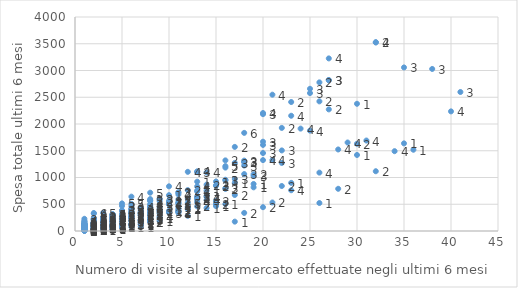
| Category | spesa |
|---|---|
| 4.0 | 309 |
| 6.0 | 295 |
| 3.0 | 101 |
| 3.0 | 71 |
| 5.0 | 144 |
| 1.0 | 9 |
| 1.0 | 52 |
| 18.0 | 1223 |
| 5.0 | 72 |
| 10.0 | 341 |
| 1.0 | 89 |
| 4.0 | 41 |
| 2.0 | 75 |
| 2.0 | 194 |
| 2.0 | 35 |
| 8.0 | 177 |
| 2.0 | 71 |
| 4.0 | 72 |
| 6.0 | 364 |
| 1.0 | 85 |
| 1.0 | 127 |
| 9.0 | 330 |
| 1.0 | 58 |
| 17.0 | 1273 |
| 6.0 | 247 |
| 8.0 | 344 |
| 3.0 | 339 |
| 7.0 | 355 |
| 1.0 | 84 |
| 2.0 | 110 |
| 2.0 | 145 |
| 1.0 | 33 |
| 4.0 | 284 |
| 16.0 | 1185 |
| 2.0 | 39 |
| 6.0 | 235 |
| 22.0 | 1506 |
| 11.0 | 683 |
| 1.0 | 93 |
| 11.0 | 359 |
| 7.0 | 441 |
| 18.0 | 1287 |
| 2.0 | 20 |
| 1.0 | 85 |
| 3.0 | 144 |
| 20.0 | 1325 |
| 15.0 | 505 |
| 1.0 | 67 |
| 14.0 | 639 |
| 2.0 | 151 |
| 2.0 | 212 |
| 5.0 | 141 |
| 8.0 | 298 |
| 7.0 | 341 |
| 1.0 | 25 |
| 1.0 | 105 |
| 3.0 | 156 |
| 2.0 | 73 |
| 13.0 | 835 |
| 1.0 | 41 |
| 5.0 | 215 |
| 5.0 | 92 |
| 1.0 | 7 |
| 23.0 | 2411 |
| 25.0 | 2658 |
| 2.0 | 38 |
| 1.0 | 24 |
| 3.0 | 166 |
| 5.0 | 92 |
| 2.0 | 171 |
| 6.0 | 124 |
| 12.0 | 410 |
| 12.0 | 284 |
| 7.0 | 125 |
| 4.0 | 115 |
| 17.0 | 972 |
| 4.0 | 97 |
| 8.0 | 343 |
| 4.0 | 135 |
| 1.0 | 64 |
| 2.0 | 51 |
| 1.0 | 125 |
| 1.0 | 38 |
| 3.0 | 200 |
| 11.0 | 380 |
| 8.0 | 352 |
| 2.0 | 62 |
| 13.0 | 740 |
| 2.0 | 336 |
| 27.0 | 2819 |
| 1.0 | 51 |
| 11.0 | 541 |
| 5.0 | 170 |
| 1.0 | 29 |
| 6.0 | 234 |
| 9.0 | 593 |
| 9.0 | 188 |
| 2.0 | 149 |
| 14.0 | 867 |
| 2.0 | 72 |
| 14.0 | 1094 |
| 7.0 | 293 |
| 20.0 | 1609 |
| 2.0 | 129 |
| 4.0 | 96 |
| 22.0 | 1272 |
| 6.0 | 363 |
| 2.0 | 102 |
| 13.0 | 922 |
| 2.0 | 100 |
| 35.0 | 3057 |
| 15.0 | 563 |
| 2.0 | 54 |
| 2.0 | 60 |
| 5.0 | 264 |
| 5.0 | 276 |
| 1.0 | 100 |
| 6.0 | 298 |
| 4.0 | 133 |
| 1.0 | 20 |
| 3.0 | 121 |
| 1.0 | 23 |
| 2.0 | 147 |
| 8.0 | 442 |
| 17.0 | 901 |
| 6.0 | 343 |
| 2.0 | 123 |
| 3.0 | 235 |
| 4.0 | 278 |
| 6.0 | 260 |
| 1.0 | 149 |
| 30.0 | 2378 |
| 3.0 | 55 |
| 5.0 | 232 |
| 1.0 | 22 |
| 22.0 | 841 |
| 16.0 | 1320 |
| 1.0 | 75 |
| 2.0 | 77 |
| 1.0 | 118 |
| 3.0 | 209 |
| 10.0 | 533 |
| 2.0 | 103 |
| 2.0 | 131 |
| 3.0 | 83 |
| 8.0 | 315 |
| 3.0 | 132 |
| 9.0 | 242 |
| 1.0 | 48 |
| 4.0 | 192 |
| 7.0 | 197 |
| 1.0 | 5 |
| 22.0 | 1927 |
| 4.0 | 215 |
| 4.0 | 41 |
| 4.0 | 238 |
| 21.0 | 1325 |
| 14.0 | 658 |
| 23.0 | 762 |
| 13.0 | 756 |
| 4.0 | 109 |
| 2.0 | 53 |
| 41.0 | 2598 |
| 1.0 | 119 |
| 1.0 | 114 |
| 12.0 | 425 |
| 8.0 | 435 |
| 35.0 | 1638 |
| 1.0 | 88 |
| 1.0 | 76 |
| 3.0 | 163 |
| 8.0 | 344 |
| 6.0 | 190 |
| 12.0 | 525 |
| 3.0 | 69 |
| 1.0 | 103 |
| 17.0 | 1572 |
| 3.0 | 26 |
| 8.0 | 387 |
| 12.0 | 604 |
| 2.0 | 86 |
| 20.0 | 1669 |
| 2.0 | 74 |
| 2.0 | 326 |
| 31.0 | 1691 |
| 5.0 | 374 |
| 3.0 | 254 |
| 2.0 | 53 |
| 38.0 | 3029 |
| 1.0 | 69 |
| 2.0 | 22 |
| 7.0 | 298 |
| 2.0 | 224 |
| 9.0 | 600 |
| 7.0 | 321 |
| 3.0 | 144 |
| 3.0 | 258 |
| 30.0 | 1421 |
| 6.0 | 81 |
| 13.0 | 582 |
| 2.0 | 119 |
| 3.0 | 157 |
| 2.0 | 154 |
| 28.0 | 1524 |
| 11.0 | 515 |
| 18.0 | 1316 |
| 32.0 | 3529 |
| 11.0 | 357 |
| 26.0 | 523 |
| 10.0 | 508 |
| 6.0 | 508 |
| 6.0 | 257 |
| 34.0 | 1492 |
| 3.0 | 174 |
| 13.0 | 461 |
| 1.0 | 10 |
| 1.0 | 55 |
| 2.0 | 72 |
| 8.0 | 235 |
| 2.0 | 161 |
| 6.0 | 179 |
| 5.0 | 387 |
| 7.0 | 170 |
| 4.0 | 197 |
| 11.0 | 585 |
| 20.0 | 2184 |
| 11.0 | 339 |
| 9.0 | 369 |
| 5.0 | 239 |
| 2.0 | 92 |
| 19.0 | 1060 |
| 13.0 | 538 |
| 8.0 | 476 |
| 4.0 | 197 |
| 2.0 | 59 |
| 2.0 | 67 |
| 2.0 | 121 |
| 1.0 | 46 |
| 3.0 | 72 |
| 2.0 | 63 |
| 6.0 | 274 |
| 1.0 | 107 |
| 2.0 | 34 |
| 5.0 | 150 |
| 4.0 | 140 |
| 5.0 | 469 |
| 4.0 | 100 |
| 1.0 | 54 |
| 2.0 | 95 |
| 10.0 | 376 |
| 2.0 | 45 |
| 2.0 | 71 |
| 3.0 | 119 |
| 12.0 | 764 |
| 6.0 | 417 |
| 4.0 | 162 |
| 8.0 | 297 |
| 1.0 | 52 |
| 2.0 | 69 |
| 2.0 | 26 |
| 1.0 | 75 |
| 4.0 | 148 |
| 4.0 | 230 |
| 5.0 | 68 |
| 16.0 | 946 |
| 9.0 | 389 |
| 10.0 | 365 |
| 3.0 | 146 |
| 11.0 | 724 |
| 2.0 | 153 |
| 4.0 | 232 |
| 2.0 | 46 |
| 1.0 | 62 |
| 1.0 | 30 |
| 10.0 | 563 |
| 9.0 | 441 |
| 19.0 | 879 |
| 11.0 | 716 |
| 5.0 | 516 |
| 4.0 | 291 |
| 3.0 | 53 |
| 4.0 | 71 |
| 1.0 | 62 |
| 11.0 | 456 |
| 2.0 | 69 |
| 4.0 | 94 |
| 19.0 | 816 |
| 2.0 | 141 |
| 3.0 | 74 |
| 3.0 | 54 |
| 25.0 | 2578 |
| 7.0 | 348 |
| 7.0 | 355 |
| 14.0 | 429 |
| 3.0 | 189 |
| 7.0 | 200 |
| 2.0 | 149 |
| 1.0 | 59 |
| 4.0 | 189 |
| 2.0 | 106 |
| 1.0 | 12 |
| 4.0 | 196 |
| 5.0 | 99 |
| 1.0 | 37 |
| 2.0 | 239 |
| 1.0 | 24 |
| 8.0 | 201 |
| 4.0 | 247 |
| 10.0 | 670 |
| 24.0 | 1914 |
| 2.0 | 25 |
| 18.0 | 1834 |
| 1.0 | 105 |
| 13.0 | 630 |
| 6.0 | 467 |
| 18.0 | 1064 |
| 2.0 | 210 |
| 8.0 | 366 |
| 14.0 | 754 |
| 3.0 | 77 |
| 7.0 | 394 |
| 16.0 | 799 |
| 5.0 | 114 |
| 13.0 | 608 |
| 20.0 | 445 |
| 3.0 | 160 |
| 1.0 | 46 |
| 32.0 | 3524 |
| 1.0 | 121 |
| 27.0 | 3226 |
| 7.0 | 330 |
| 23.0 | 2154 |
| 27.0 | 2821 |
| 11.0 | 517 |
| 8.0 | 176 |
| 3.0 | 199 |
| 25.0 | 1876 |
| 3.0 | 109 |
| 2.0 | 157 |
| 3.0 | 55 |
| 2.0 | 211 |
| 1.0 | 3 |
| 15.0 | 925 |
| 1.0 | 17 |
| 4.0 | 168 |
| 8.0 | 398 |
| 21.0 | 2548 |
| 4.0 | 187 |
| 7.0 | 306 |
| 26.0 | 2778 |
| 1.0 | 119 |
| 18.0 | 1290 |
| 1.0 | 137 |
| 2.0 | 122 |
| 7.0 | 216 |
| 1.0 | 49 |
| 26.0 | 1091 |
| 5.0 | 238 |
| 15.0 | 846 |
| 3.0 | 189 |
| 2.0 | 146 |
| 12.0 | 449 |
| 7.0 | 412 |
| 1.0 | 45 |
| 32.0 | 1117 |
| 1.0 | 53 |
| 17.0 | 673 |
| 1.0 | 26 |
| 7.0 | 151 |
| 1.0 | 123 |
| 2.0 | 230 |
| 2.0 | 47 |
| 4.0 | 87 |
| 7.0 | 120 |
| 1.0 | 55 |
| 5.0 | 132 |
| 15.0 | 854 |
| 16.0 | 788 |
| 8.0 | 246 |
| 1.0 | 89 |
| 1.0 | 138 |
| 8.0 | 341 |
| 1.0 | 72 |
| 3.0 | 186 |
| 1.0 | 53 |
| 6.0 | 642 |
| 1.0 | 32 |
| 8.0 | 414 |
| 4.0 | 48 |
| 30.0 | 1630 |
| 3.0 | 79 |
| 1.0 | 171 |
| 14.0 | 579 |
| 4.0 | 313 |
| 12.0 | 1106 |
| 4.0 | 260 |
| 2.0 | 142 |
| 8.0 | 571 |
| 3.0 | 39 |
| 8.0 | 327 |
| 2.0 | 69 |
| 4.0 | 246 |
| 8.0 | 217 |
| 29.0 | 1654 |
| 16.0 | 1213 |
| 6.0 | 121 |
| 5.0 | 205 |
| 1.0 | 24 |
| 4.0 | 310 |
| 5.0 | 311 |
| 4.0 | 300 |
| 1.0 | 76 |
| 7.0 | 195 |
| 1.0 | 48 |
| 23.0 | 900 |
| 20.0 | 1457 |
| 6.0 | 325 |
| 4.0 | 77 |
| 1.0 | 114 |
| 1.0 | 104 |
| 10.0 | 835 |
| 5.0 | 315 |
| 1.0 | 33 |
| 3.0 | 198 |
| 2.0 | 87 |
| 2.0 | 53 |
| 5.0 | 186 |
| 2.0 | 121 |
| 11.0 | 379 |
| 8.0 | 504 |
| 3.0 | 145 |
| 28.0 | 789 |
| 8.0 | 716 |
| 17.0 | 175 |
| 6.0 | 329 |
| 5.0 | 281 |
| 3.0 | 85 |
| 9.0 | 271 |
| 2.0 | 162 |
| 18.0 | 338 |
| 7.0 | 195 |
| 3.0 | 145 |
| 3.0 | 158 |
| 10.0 | 497 |
| 8.0 | 453 |
| 5.0 | 198 |
| 7.0 | 83 |
| 1.0 | 87 |
| 1.0 | 53 |
| 8.0 | 561 |
| 1.0 | 29 |
| 1.0 | 61 |
| 1.0 | 177 |
| 2.0 | 94 |
| 9.0 | 560 |
| 36.0 | 1519 |
| 7.0 | 155 |
| 5.0 | 236 |
| 20.0 | 2205 |
| 4.0 | 275 |
| 8.0 | 366 |
| 7.0 | 298 |
| 1.0 | 228 |
| 8.0 | 170 |
| 16.0 | 958 |
| 13.0 | 646 |
| 5.0 | 226 |
| 3.0 | 200 |
| 3.0 | 61 |
| 5.0 | 170 |
| 3.0 | 147 |
| 2.0 | 141 |
| 7.0 | 329 |
| 19.0 | 1032 |
| 1.0 | 49 |
| 1.0 | 55 |
| 21.0 | 533 |
| 27.0 | 2273 |
| 6.0 | 129 |
| 2.0 | 88 |
| 1.0 | 42 |
| 7.0 | 194 |
| 16.0 | 504 |
| 2.0 | 98 |
| 15.0 | 466 |
| 13.0 | 1100 |
| 26.0 | 2423 |
| 1.0 | 191 |
| 5.0 | 175 |
| 3.0 | 71 |
| 6.0 | 400 |
| 5.0 | 165 |
| 40.0 | 2236 |
| 8.0 | 597 |
| 3.0 | 198 |
| 1.0 | 35 |
| 7.0 | 255 |
| 2.0 | 69 |
| 11.0 | 416 |
| 1.0 | 68 |
| 3.0 | 228 |
| 6.0 | 264 |
| 6.0 | 413 |
| 13.0 | 1115 |
| 1.0 | 73 |
| 2.0 | 21 |
| 2.0 | 148 |
| 3.0 | 161 |